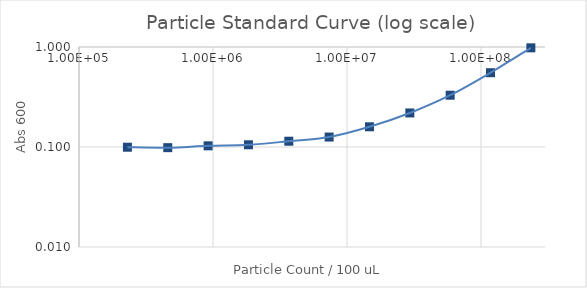
| Category | Series 1 |
|---|---|
| 235294117.64705887 | 0.981 |
| 117647058.82352944 | 0.553 |
| 58823529.41176472 | 0.33 |
| 29411764.70588236 | 0.219 |
| 14705882.35294118 | 0.159 |
| 7352941.17647059 | 0.126 |
| 3676470.588235295 | 0.114 |
| 1838235.2941176475 | 0.105 |
| 919117.6470588237 | 0.103 |
| 459558.82352941186 | 0.098 |
| 229779.41176470593 | 0.1 |